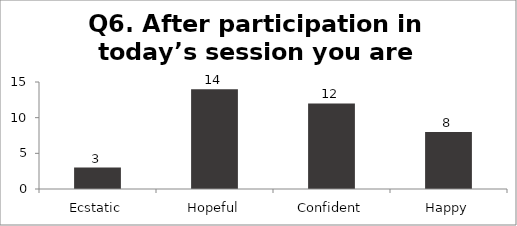
| Category | Q6. After participation in today’s session you are feeling? |
|---|---|
| Ecstatic | 3 |
| Hopeful | 14 |
| Confident | 12 |
| Happy | 8 |